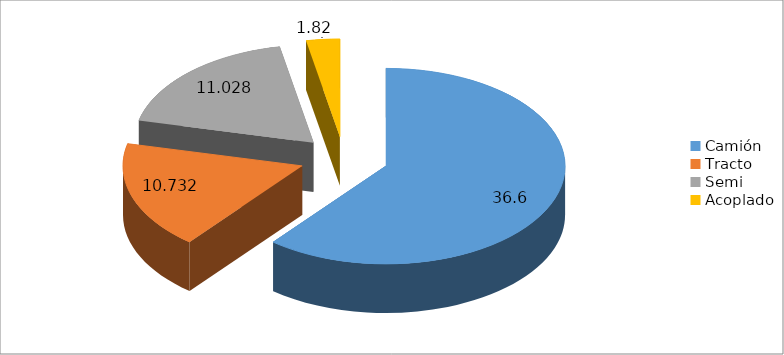
| Category | Series 0 |
|---|---|
| Camión | 36.6 |
| Tracto | 10.732 |
| Semi | 11.028 |
| Acoplado | 1.82 |